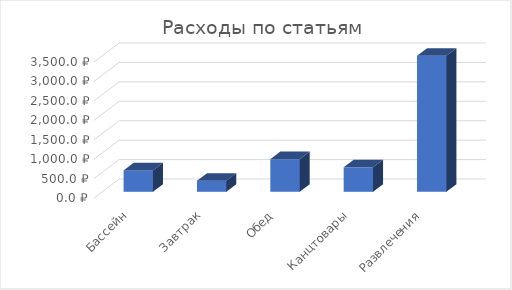
| Category | Series 0 |
|---|---|
| Бассейн | 550 |
| Завтрак | 285 |
| Обед | 840 |
| Канцтовары | 630 |
| Развлечения | 3500 |